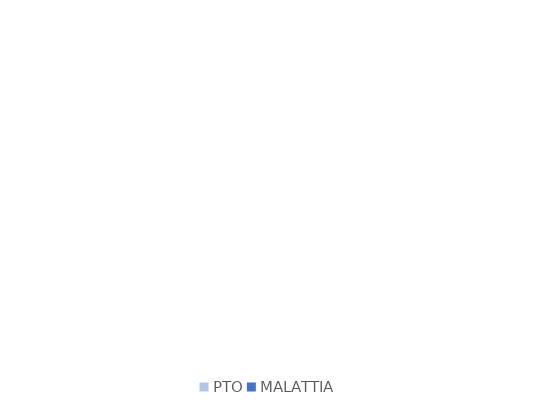
| Category | Series 0 |
|---|---|
| PTO | 0 |
| MALATTIA | 0 |